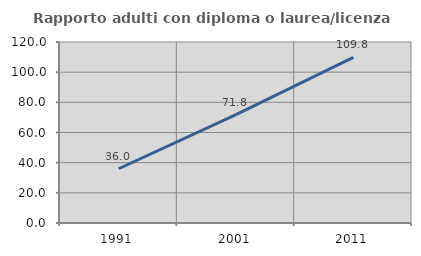
| Category | Rapporto adulti con diploma o laurea/licenza media  |
|---|---|
| 1991.0 | 35.965 |
| 2001.0 | 71.795 |
| 2011.0 | 109.825 |